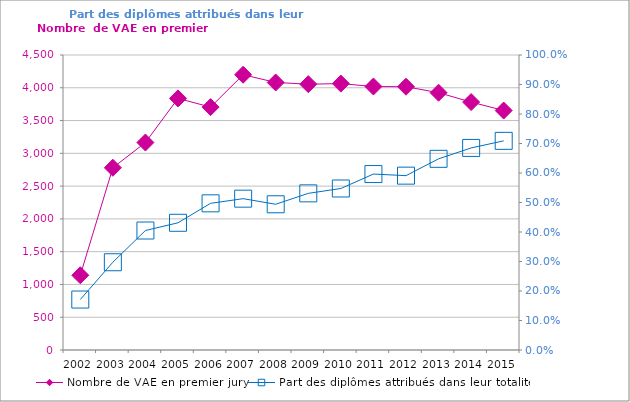
| Category | Nombre de VAE en premier jury |
|---|---|
| 2002.0 | 1140 |
| 2003.0 | 2780 |
| 2004.0 | 3165 |
| 2005.0 | 3838 |
| 2006.0 | 3705 |
| 2007.0 | 4199 |
| 2008.0 | 4081 |
| 2009.0 | 4055 |
| 2010.0 | 4064 |
| 2011.0 | 4019 |
| 2012.0 | 4016 |
| 2013.0 | 3925 |
| 2014.0 | 3782 |
| 2015.0 | 3653 |